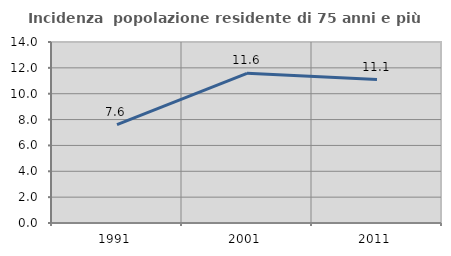
| Category | Incidenza  popolazione residente di 75 anni e più |
|---|---|
| 1991.0 | 7.614 |
| 2001.0 | 11.574 |
| 2011.0 | 11.096 |